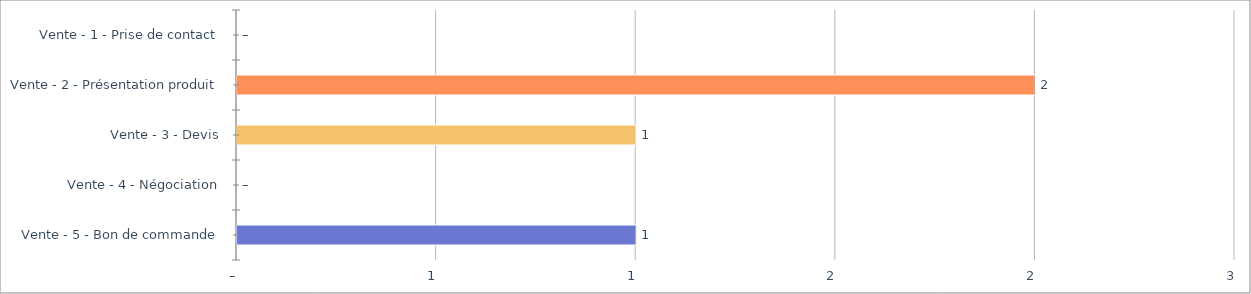
| Category | Series 0 |
|---|---|
| Vente - 1 - Prise de contact | 0 |
| Vente - 2 - Présentation produit | 2 |
| Vente - 3 - Devis | 1 |
| Vente - 4 - Négociation | 0 |
| Vente - 5 - Bon de commande | 1 |